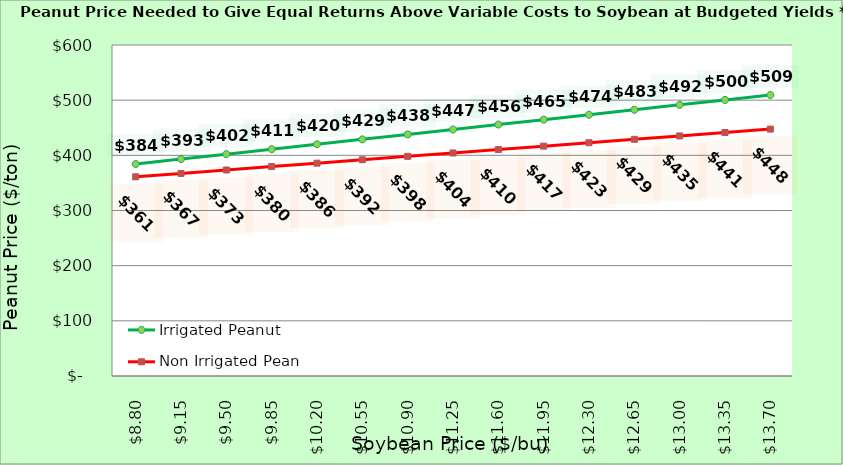
| Category | Irrigated Peanut | Non Irrigated Peanut |
|---|---|---|
| 8.800000000000002 | 384.278 | 361.069 |
| 9.150000000000002 | 393.214 | 367.245 |
| 9.500000000000002 | 402.15 | 373.422 |
| 9.850000000000001 | 411.087 | 379.598 |
| 10.200000000000001 | 420.023 | 385.775 |
| 10.55 | 428.959 | 391.951 |
| 10.9 | 437.895 | 398.128 |
| 11.25 | 446.831 | 404.304 |
| 11.6 | 455.767 | 410.481 |
| 11.95 | 464.704 | 416.657 |
| 12.299999999999999 | 473.64 | 422.833 |
| 12.649999999999999 | 482.576 | 429.01 |
| 12.999999999999998 | 491.512 | 435.186 |
| 13.349999999999998 | 500.448 | 441.363 |
| 13.699999999999998 | 509.384 | 447.539 |